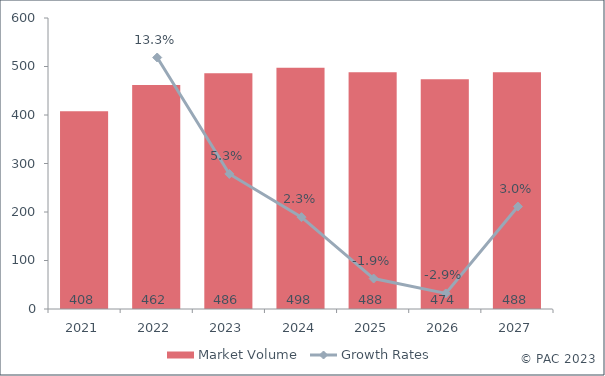
| Category | Market Volume |
|---|---|
| 2021.0 | 407.757 |
| 2022.0 | 461.928 |
| 2023.0 | 486.336 |
| 2024.0 | 497.582 |
| 2025.0 | 488.094 |
| 2026.0 | 473.793 |
| 2027.0 | 488.195 |